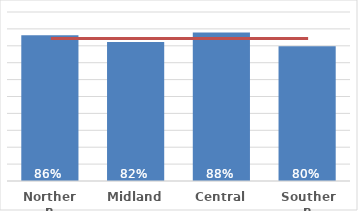
| Category | Māori |
|---|---|
| Northern | 0.863 |
| Midland | 0.822 |
| Central | 0.878 |
| Southern | 0.798 |